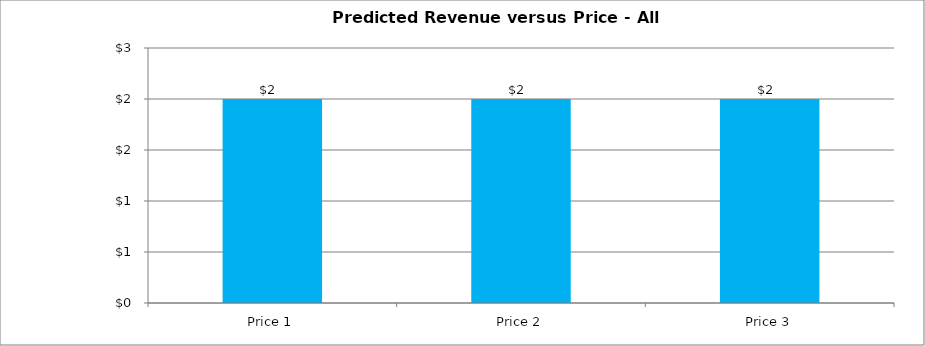
| Category | Predicted Revenue |
|---|---|
| Price 1 | 2 |
| Price 2 | 2 |
| Price 3 | 2 |